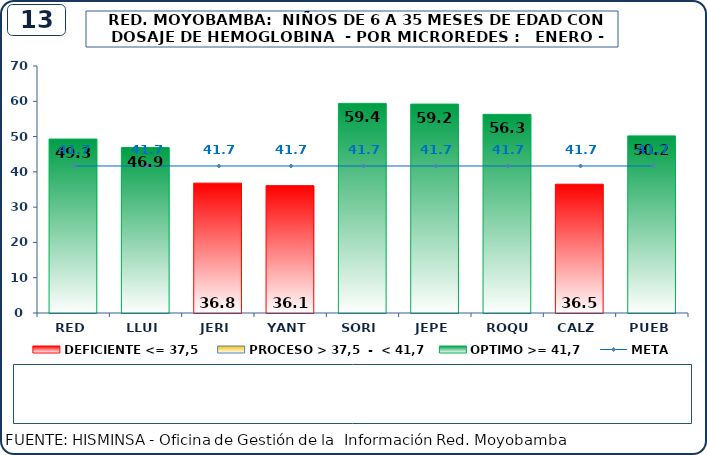
| Category | DEFICIENTE <= 37,5 | PROCESO > 37,5  -  < 41,7 | OPTIMO >= 41,7 |
|---|---|---|---|
| RED | 0 | 0 | 49.3 |
| LLUI | 0 | 0 | 46.9 |
| JERI | 36.8 | 0 | 0 |
| YANT | 36.1 | 0 | 0 |
| SORI | 0 | 0 | 59.4 |
| JEPE | 0 | 0 | 59.2 |
| ROQU | 0 | 0 | 56.3 |
| CALZ | 36.5 | 0 | 0 |
| PUEB | 0 | 0 | 50.2 |